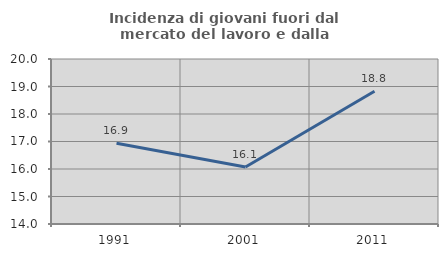
| Category | Incidenza di giovani fuori dal mercato del lavoro e dalla formazione  |
|---|---|
| 1991.0 | 16.935 |
| 2001.0 | 16.076 |
| 2011.0 | 18.826 |